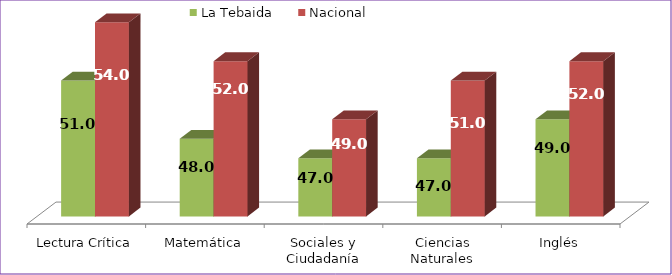
| Category | La Tebaida | Nacional |
|---|---|---|
| Lectura Crítica | 51 | 54 |
| Matemática | 48 | 52 |
| Sociales y Ciudadanía | 47 | 49 |
| Ciencias Naturales | 47 | 51 |
| Inglés | 49 | 52 |